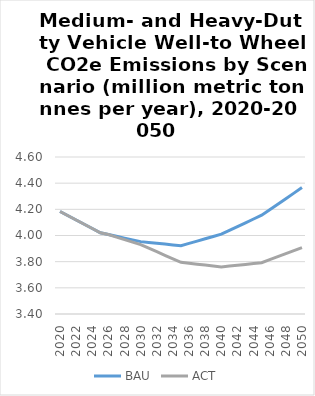
| Category | BAU | ACT |
|---|---|---|
| 2020.0 | 4.184 | 4.184 |
| 2021.0 | 4.151 | 4.151 |
| 2022.0 | 4.118 | 4.118 |
| 2023.0 | 4.086 | 4.086 |
| 2024.0 | 4.053 | 4.053 |
| 2025.0 | 4.021 | 4.021 |
| 2026.0 | 4.007 | 4.007 |
| 2027.0 | 3.994 | 3.988 |
| 2028.0 | 3.98 | 3.969 |
| 2029.0 | 3.967 | 3.949 |
| 2030.0 | 3.953 | 3.93 |
| 2031.0 | 3.947 | 3.903 |
| 2032.0 | 3.941 | 3.876 |
| 2033.0 | 3.934 | 3.849 |
| 2034.0 | 3.928 | 3.822 |
| 2035.0 | 3.922 | 3.795 |
| 2036.0 | 3.939 | 3.788 |
| 2037.0 | 3.957 | 3.781 |
| 2038.0 | 3.975 | 3.774 |
| 2039.0 | 3.992 | 3.767 |
| 2040.0 | 4.01 | 3.76 |
| 2041.0 | 4.039 | 3.766 |
| 2042.0 | 4.068 | 3.773 |
| 2043.0 | 4.097 | 3.779 |
| 2044.0 | 4.126 | 3.785 |
| 2045.0 | 4.155 | 3.792 |
| 2046.0 | 4.197 | 3.815 |
| 2047.0 | 4.239 | 3.838 |
| 2048.0 | 4.282 | 3.861 |
| 2049.0 | 4.324 | 3.884 |
| 2050.0 | 4.366 | 3.907 |